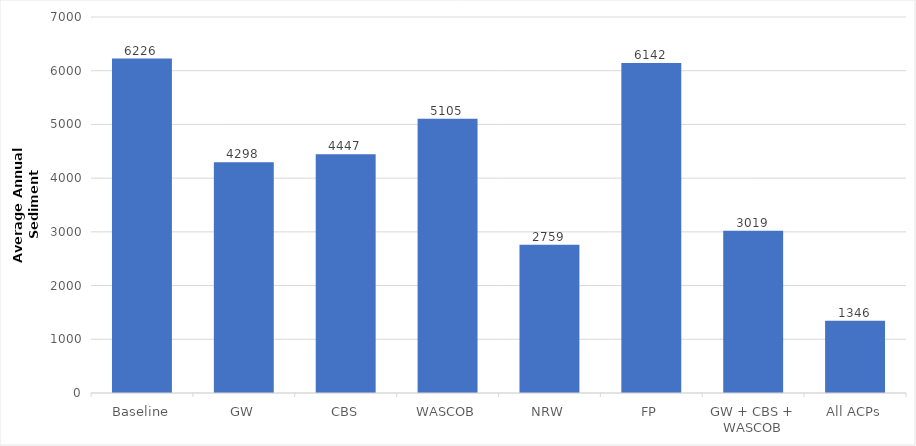
| Category | Average Annual Sediment Load (metric tons) |
|---|---|
| Baseline | 6225.73 |
| GW | 4298.135 |
| CBS | 4447 |
| WASCOB | 5105.297 |
| NRW | 2758.757 |
| FP | 6141.703 |
| GW + CBS + WASCOB | 3018.649 |
| All ACPs | 1345.741 |